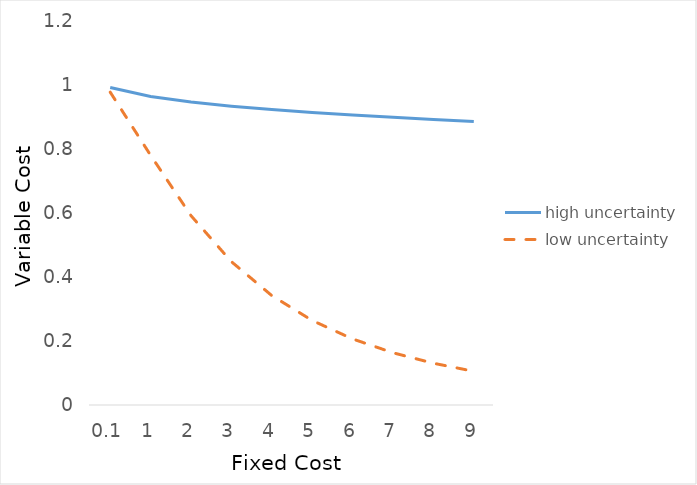
| Category | high uncertainty | low uncertainty |
|---|---|---|
| 0.1 | 0.992 | 0.978 |
| 1.0 | 0.964 | 0.78 |
| 2.0 | 0.947 | 0.592 |
| 3.0 | 0.934 | 0.448 |
| 4.0 | 0.923 | 0.342 |
| 5.0 | 0.914 | 0.264 |
| 6.0 | 0.906 | 0.206 |
| 7.0 | 0.899 | 0.163 |
| 8.0 | 0.892 | 0.13 |
| 9.0 | 0.886 | 0.105 |